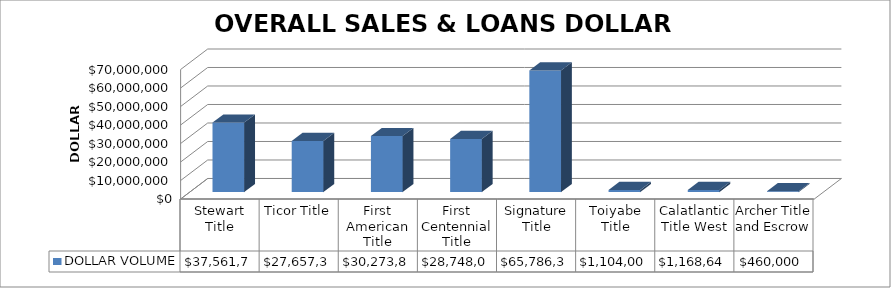
| Category | DOLLAR VOLUME |
|---|---|
| Stewart Title | 37561740 |
| Ticor Title | 27657399 |
| First American Title | 30273818 |
| First Centennial Title | 28748057 |
| Signature Title | 65786342 |
| Toiyabe Title | 1104000 |
| Calatlantic Title West | 1168640 |
| Archer Title and Escrow | 460000 |